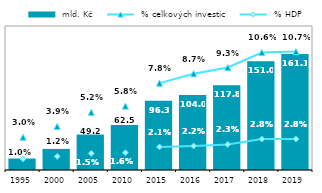
| Category |  mld. Kč |
|---|---|
| 1995 | 15.955 |
| 2000 | 29.274 |
| 2005 | 49.228 |
| 2010 | 62.501 |
| 2015 | 96.27 |
| 2016 | 104.02 |
| 2017 | 117.816 |
| 2018 | 150.99 |
| 2019 | 161.093 |